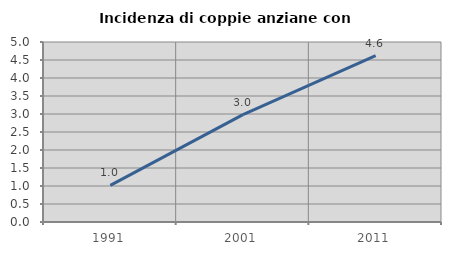
| Category | Incidenza di coppie anziane con figli |
|---|---|
| 1991.0 | 1.018 |
| 2001.0 | 2.982 |
| 2011.0 | 4.621 |